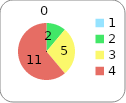
| Category | Series 0 |
|---|---|
| 0 | 0 |
| 1 | 2 |
| 2 | 5 |
| 3 | 11 |